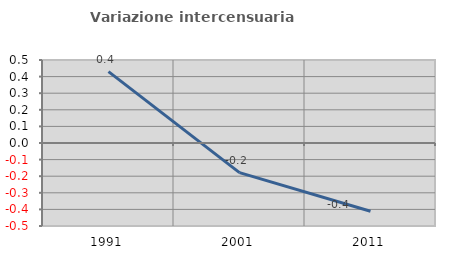
| Category | Variazione intercensuaria annua |
|---|---|
| 1991.0 | 0.43 |
| 2001.0 | -0.178 |
| 2011.0 | -0.411 |